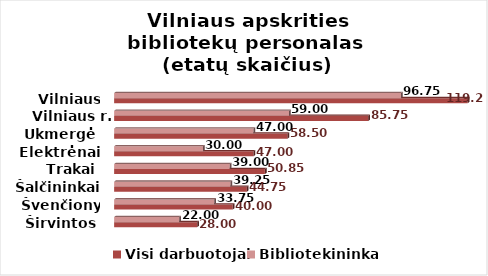
| Category | Visi darbuotojai | Bibliotekininkai |
|---|---|---|
| Širvintos | 28 | 22 |
| Švenčionys | 40 | 33.75 |
| Šalčininkai | 44.75 | 39.25 |
| Trakai | 50.85 | 39 |
| Elektrėnai | 47 | 30 |
| Ukmergė | 58.5 | 47 |
| Vilniaus r. | 85.75 | 59 |
| Vilniaus m. | 119.25 | 96.75 |